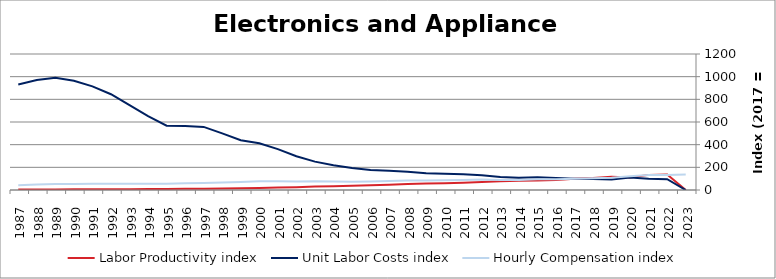
| Category | Labor Productivity index | Unit Labor Costs index | Hourly Compensation index |
|---|---|---|---|
| 2023.0 | 0 | 0 | 136.933 |
| 2022.0 | 137.008 | 95.83 | 131.294 |
| 2021.0 | 133.404 | 99.549 | 132.802 |
| 2020.0 | 110.443 | 110.568 | 122.114 |
| 2019.0 | 115.922 | 93.277 | 108.129 |
| 2018.0 | 106.099 | 97.034 | 102.951 |
| 2017.0 | 100 | 100 | 100 |
| 2016.0 | 88.93 | 106.056 | 94.315 |
| 2015.0 | 84.772 | 112.29 | 95.19 |
| 2014.0 | 81.939 | 108.46 | 88.872 |
| 2013.0 | 77.915 | 113.673 | 88.568 |
| 2012.0 | 70.952 | 130.012 | 92.246 |
| 2011.0 | 64.217 | 138.061 | 88.658 |
| 2010.0 | 59.905 | 142.504 | 85.367 |
| 2009.0 | 56.956 | 146.937 | 83.69 |
| 2008.0 | 51.963 | 161.151 | 83.739 |
| 2007.0 | 46.441 | 170.027 | 78.963 |
| 2006.0 | 42.281 | 177.037 | 74.853 |
| 2005.0 | 38.075 | 193.293 | 73.596 |
| 2004.0 | 34.173 | 217.636 | 74.373 |
| 2003.0 | 30.508 | 250.27 | 76.353 |
| 2002.0 | 25.065 | 297.538 | 74.578 |
| 2001.0 | 21.163 | 360.876 | 76.372 |
| 2000.0 | 18.682 | 411.782 | 76.928 |
| 1999.0 | 16.256 | 439.617 | 71.465 |
| 1998.0 | 13.349 | 499.773 | 66.714 |
| 1997.0 | 11.192 | 556.621 | 62.296 |
| 1996.0 | 10.403 | 564.688 | 58.743 |
| 1995.0 | 9.78 | 567.561 | 55.51 |
| 1994.0 | 8.585 | 651.378 | 55.92 |
| 1993.0 | 7.38 | 749.467 | 55.312 |
| 1992.0 | 6.559 | 844.826 | 55.415 |
| 1991.0 | 5.943 | 914.163 | 54.328 |
| 1990.0 | 5.587 | 963.768 | 53.848 |
| 1989.0 | 5.272 | 989.429 | 52.159 |
| 1988.0 | 5.03 | 971.352 | 48.858 |
| 1987.0 | 4.47 | 931.506 | 41.64 |